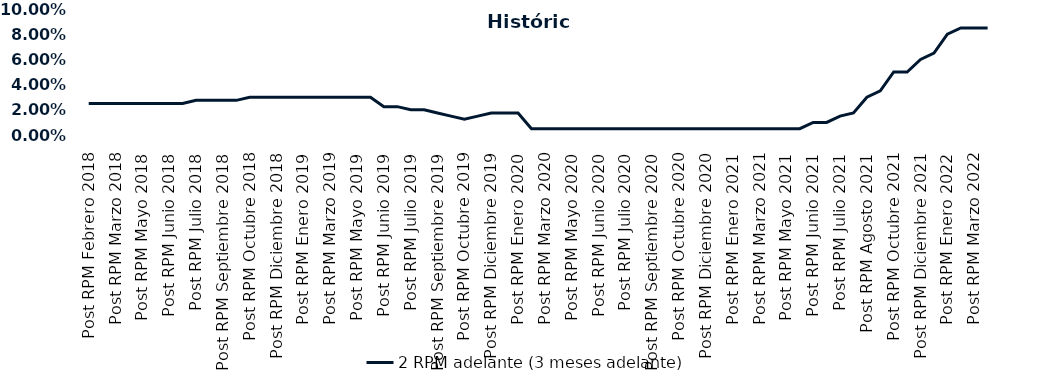
| Category | 2 RPM adelante (3 meses adelante) |
|---|---|
| Post RPM Febrero 2018 | 0.025 |
| Pre RPM Marzo 2018 | 0.025 |
| Post RPM Marzo 2018 | 0.025 |
| Pre RPM Mayo 2018 | 0.025 |
| Post RPM Mayo 2018 | 0.025 |
| Pre RPM Junio 2018 | 0.025 |
| Post RPM Junio 2018 | 0.025 |
| Pre RPM Julio 2018 | 0.025 |
| Post RPM Julio 2018 | 0.028 |
| Pre RPM Septiembre 2018 | 0.028 |
| Post RPM Septiembre 2018 | 0.028 |
| Pre RPM Octubre 2018 | 0.028 |
| Post RPM Octubre 2018 | 0.03 |
| Pre RPM Diciembre 2018 | 0.03 |
| Post RPM Diciembre 2018 | 0.03 |
| Pre RPM Enero 2019 | 0.03 |
| Post RPM Enero 2019 | 0.03 |
| Pre RPM Marzo 2019 | 0.03 |
| Post RPM Marzo 2019 | 0.03 |
| Pre RPM Mayo 2019 | 0.03 |
| Post RPM Mayo 2019 | 0.03 |
| Pre RPM Junio 2019 | 0.03 |
| Post RPM Junio 2019 | 0.022 |
| Pre RPM Julio 2019 | 0.022 |
| Post RPM Julio 2019 | 0.02 |
| Pre RPM Septiembre 2019 | 0.02 |
| Post RPM Septiembre 2019 | 0.018 |
| Pre RPM Octubre 2019 | 0.015 |
| Post RPM Octubre 2019 | 0.012 |
| Pre RPM Diciembre 2019 | 0.015 |
| Post RPM Diciembre 2019 | 0.018 |
| Pre RPM Enero 2020 | 0.018 |
| Post RPM Enero 2020 | 0.018 |
| Pre RPM Marzo 2020 | 0.005 |
| Post RPM Marzo 2020 | 0.005 |
| Pre RPM Mayo 2020 | 0.005 |
| Post RPM Mayo 2020 | 0.005 |
| Pre RPM Junio 2020 | 0.005 |
| Post RPM Junio 2020 | 0.005 |
| Pre RPM Julio 2020 | 0.005 |
| Post RPM Julio 2020 | 0.005 |
| Pre RPM Septiembre 2020 | 0.005 |
| Post RPM Septiembre 2020 | 0.005 |
| Pre RPM Octubre 2020 | 0.005 |
| Post RPM Octubre 2020 | 0.005 |
| Pre RPM Diciembre 2020 | 0.005 |
| Post RPM Diciembre 2020 | 0.005 |
| Pre RPM Enero 2021 | 0.005 |
| Post RPM Enero 2021 | 0.005 |
| Pre RPM Marzo 2021 | 0.005 |
| Post RPM Marzo 2021 | 0.005 |
| Pre RPM Mayo 2021 | 0.005 |
| Post RPM Mayo 2021 | 0.005 |
| Pre RPM Junio 2021 | 0.005 |
| Post RPM Junio 2021 | 0.01 |
| Pre RPM Julio 2021 | 0.01 |
| Post RPM Julio 2021 | 0.015 |
| Pre RPM Agosto 2021 | 0.018 |
| Post RPM Agosto 2021 | 0.03 |
| Pre RPM Octubre 2021 | 0.035 |
| Post RPM Octubre 2021 | 0.05 |
| Pre RPM Diciembre 2021 | 0.05 |
| Post RPM Diciembre 2021 | 0.06 |
| Pre RPM Enero 2022 | 0.065 |
| Post RPM Enero 2022 | 0.08 |
| Pre RPM Marzo 2022 | 0.085 |
| Post RPM Marzo 2022 | 0.085 |
| Pre RPM Mayo 2022 | 0.085 |